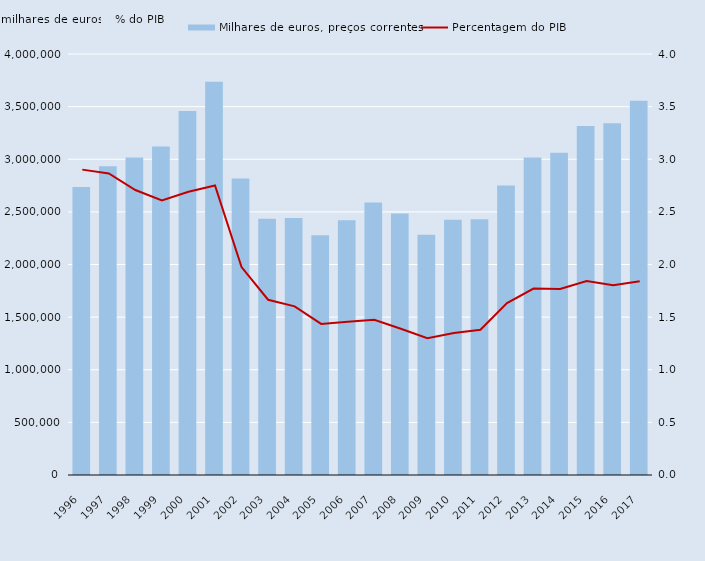
| Category | Milhares de euros, preços correntes |
|---|---|
| 1996.0 | 2737490 |
| 1997.0 | 2932550 |
| 1998.0 | 3016290 |
| 1999.0 | 3121680 |
| 2000.0 | 3458120 |
| 2001.0 | 3736820 |
| 2002.0 | 2817880 |
| 2003.0 | 2433780 |
| 2004.0 | 2442160 |
| 2005.0 | 2277250 |
| 2006.0 | 2420270 |
| 2007.0 | 2588420 |
| 2008.0 | 2484680 |
| 2009.0 | 2281870 |
| 2010.0 | 2425900 |
| 2011.0 | 2430490 |
| 2012.0 | 2749460 |
| 2013.0 | 3015780 |
| 2014.0 | 3060710 |
| 2015.0 | 3315620 |
| 2016.0 | 3343200 |
| 2017.0 | 3554750 |